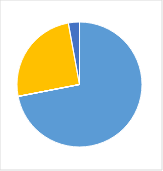
| Category | Series 0 |
|---|---|
| 0 | 0.725 |
| 1 | 0 |
| 2 | 0 |
| 3 | 0.254 |
| 4 | 0.029 |